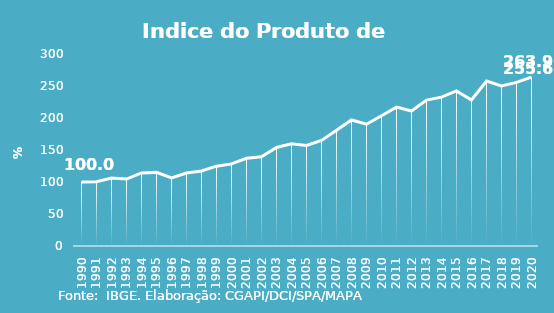
| Category | Indice de Prod. base 1990 |
|---|---|
| 1990.0 | 100 |
| 1991.0 | 100.275 |
| 1992.0 | 106.203 |
| 1993.0 | 104.57 |
| 1994.0 | 114.164 |
| 1995.0 | 115.024 |
| 1996.0 | 106.552 |
| 1997.0 | 114.037 |
| 1998.0 | 117.319 |
| 1999.0 | 124.734 |
| 2000.0 | 128.293 |
| 2001.0 | 136.975 |
| 2002.0 | 139.51 |
| 2003.0 | 153.868 |
| 2004.0 | 159.641 |
| 2005.0 | 157.136 |
| 2006.0 | 164.858 |
| 2007.0 | 180.781 |
| 2008.0 | 196.91 |
| 2009.0 | 190.309 |
| 2010.0 | 203.581 |
| 2011.0 | 217.041 |
| 2012.0 | 210.932 |
| 2013.0 | 228.009 |
| 2014.0 | 232.562 |
| 2015.0 | 242.318 |
| 2016.0 | 228.239 |
| 2017.0 | 257.766 |
| 2018.0 | 250.124 |
| 2019.0 | 255.64 |
| 2020.0 | 263.911 |